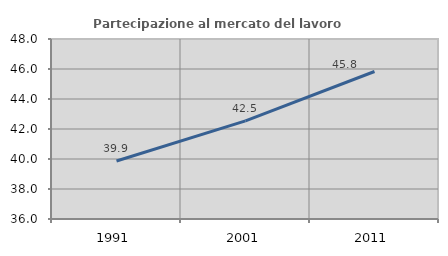
| Category | Partecipazione al mercato del lavoro  femminile |
|---|---|
| 1991.0 | 39.87 |
| 2001.0 | 42.543 |
| 2011.0 | 45.832 |